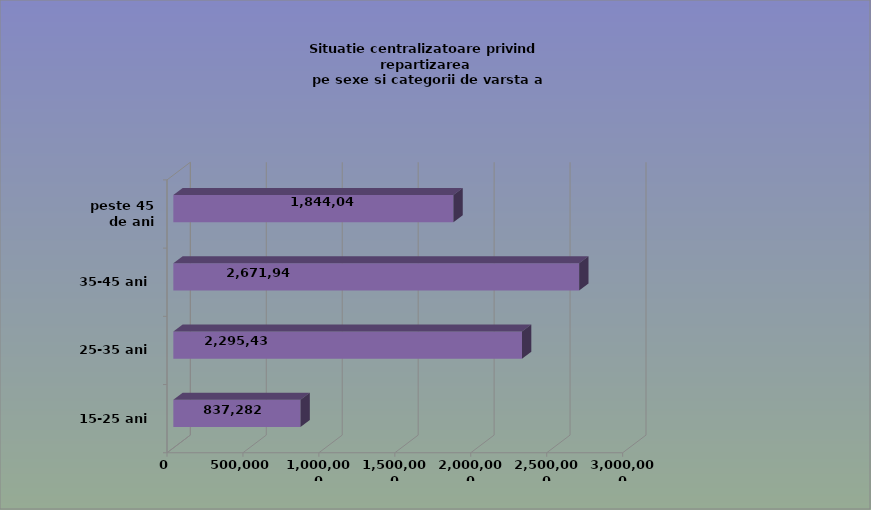
| Category | 15-25 ani 25-35 ani 35-45 ani peste 45 de ani |
|---|---|
| 15-25 ani | 837282 |
| 25-35 ani | 2295439 |
| 35-45 ani | 2671940 |
| peste 45 de ani | 1844044 |